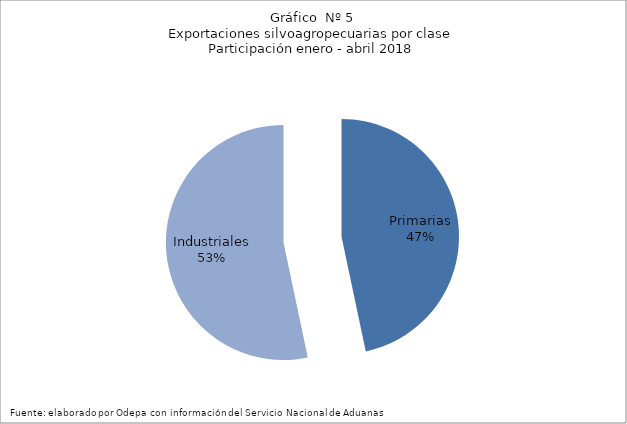
| Category | Series 0 |
|---|---|
| Primarias | 2982906 |
| Industriales | 3406750 |